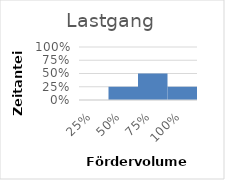
| Category | Series 1 |
|---|---|
| 0.25 | 0 |
| 0.5 | 0.25 |
| 0.75 | 0.5 |
| 1.0 | 0.25 |